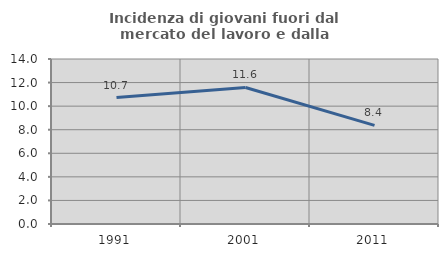
| Category | Incidenza di giovani fuori dal mercato del lavoro e dalla formazione  |
|---|---|
| 1991.0 | 10.729 |
| 2001.0 | 11.587 |
| 2011.0 | 8.373 |